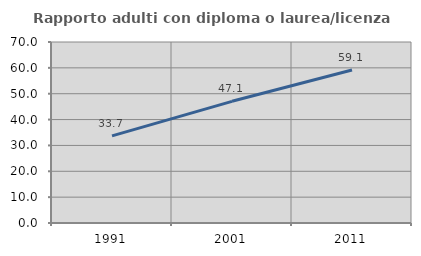
| Category | Rapporto adulti con diploma o laurea/licenza media  |
|---|---|
| 1991.0 | 33.684 |
| 2001.0 | 47.059 |
| 2011.0 | 59.146 |